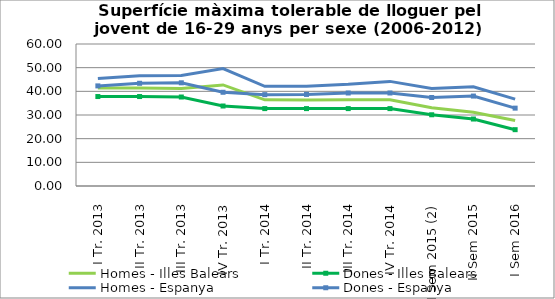
| Category | Homes - Illes Balears | Dones - Illes Balears | Homes - Espanya | Dones - Espanya |
|---|---|---|---|---|
| I Tr. 2013 | 41.4 | 37.8 | 45.4 | 42.3 |
| II Tr. 2013 | 41.4 | 37.8 | 46.6 | 43.4 |
| III Tr. 2013 | 41.2 | 37.6 | 46.7 | 43.6 |
| IV Tr. 2013 | 42.7 | 33.8 | 49.6 | 39.6 |
| I Tr. 2014 | 36.4 | 32.7 | 42.1 | 38.6 |
| II Tr. 2014 | 36.3 | 32.7 | 42.2 | 38.7 |
| III Tr. 2014 | 36.4 | 32.7 | 43 | 39.3 |
| IV Tr. 2014 | 36.4 | 32.7 | 44.2 | 39.3 |
| I Sem 2015 (2) | 33.1 | 30.1 | 41.2 | 37.4 |
| II Sem 2015 | 31.2 | 28.3 | 41.9 | 38 |
| I Sem 2016 | 27.7 | 23.8 | 36.7 | 32.9 |